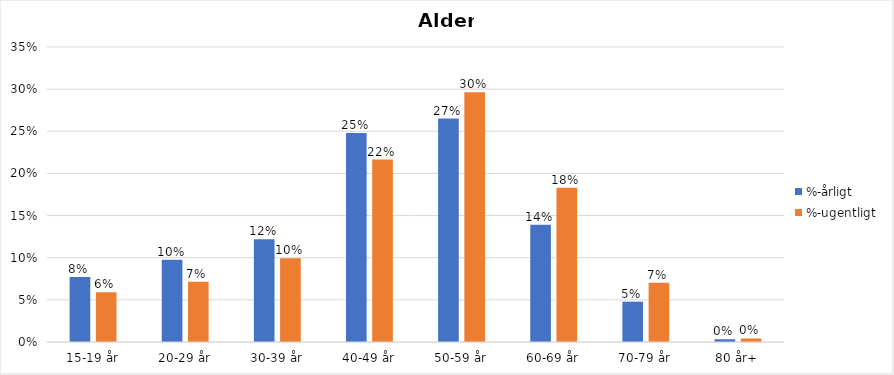
| Category | %-årligt | %-ugentligt |
|---|---|---|
| 15-19 år | 0.077 | 0.059 |
| 20-29 år | 0.098 | 0.071 |
| 30-39 år | 0.122 | 0.099 |
| 40-49 år | 0.248 | 0.216 |
| 50-59 år | 0.265 | 0.296 |
| 60-69 år | 0.139 | 0.183 |
| 70-79 år | 0.048 | 0.07 |
| 80 år+ | 0.003 | 0.004 |